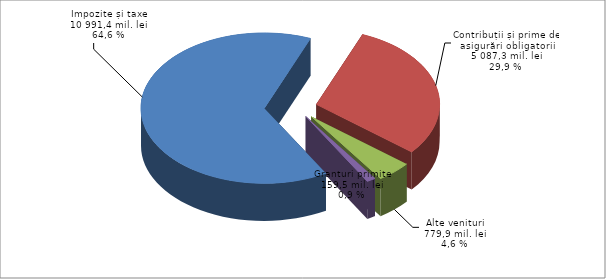
| Category | Series 0 |
|---|---|
| Impozite și taxe | 10991.4 |
| Contribuții și prime de asigurări obligatorii | 5087.3 |
| Alte venituri | 779.9 |
| Granturi primite | 200 |